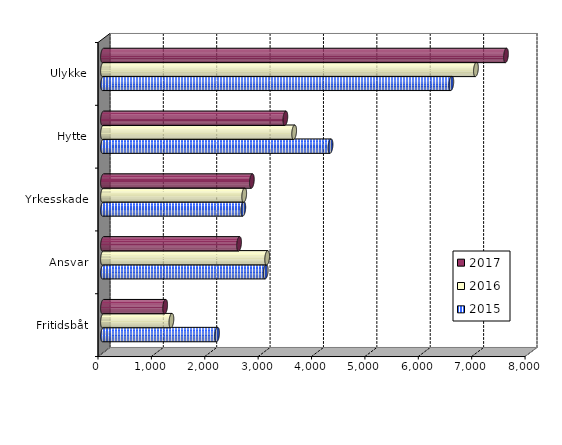
| Category | 2015 | 2016 | 2017 |
|---|---|---|---|
| Fritidsbåt | 2137 | 1281.456 | 1164.462 |
| Ansvar | 3048 | 3075.12 | 2548.829 |
| Yrkesskade | 2628 | 2645 | 2788.182 |
| Hytte | 4262 | 3580.662 | 3415.952 |
| Ulykke | 6525 | 6986 | 7548.886 |